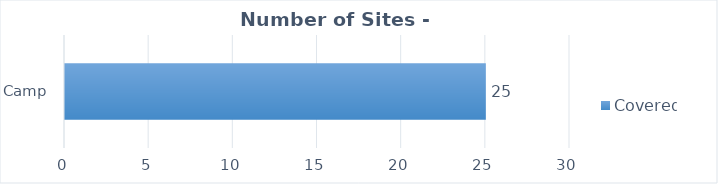
| Category | Covered |
|---|---|
| Camp | 25 |